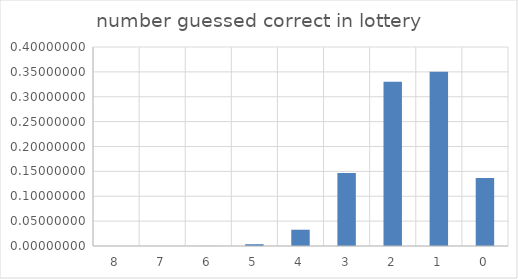
| Category | Series 0 |
|---|---|
| 8.0 | 0 |
| 7.0 | 0 |
| 6.0 | 0 |
| 5.0 | 0.004 |
| 4.0 | 0.033 |
| 3.0 | 0.147 |
| 2.0 | 0.33 |
| 1.0 | 0.35 |
| 0.0 | 0.137 |